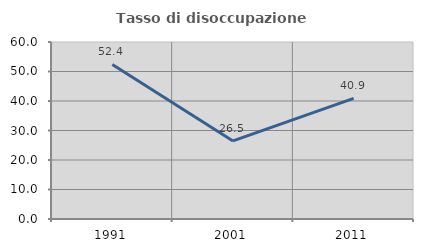
| Category | Tasso di disoccupazione giovanile  |
|---|---|
| 1991.0 | 52.381 |
| 2001.0 | 26.471 |
| 2011.0 | 40.909 |